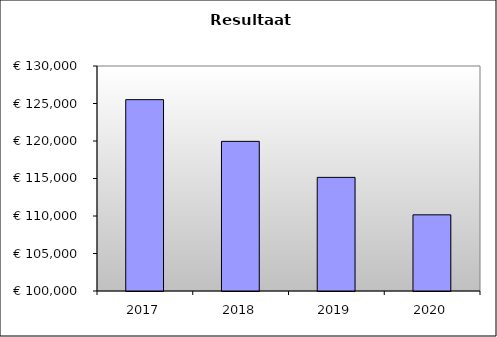
| Category | Series 0 |
|---|---|
| 2017.0 | 125513.649 |
| 2018.0 | 119951.027 |
| 2019.0 | 115148.861 |
| 2020.0 | 110154.186 |